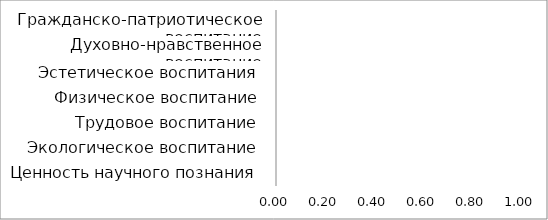
| Category | Series 0 |
|---|---|
| Гражданско-патриотическое воспитание | 0 |
| Духовно-нравственное воспитание | 0 |
| Эстетическое воспитания | 0 |
| Физическое воспитание | 0 |
| Трудовое воспитание | 0 |
| Экологическое воспитание | 0 |
| Ценность научного познания | 0 |